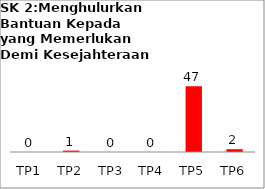
| Category | Bil Pel |
|---|---|
| TP1 | 0 |
| TP2 | 1 |
| TP3 | 0 |
| TP4 | 0 |
| TP5 | 47 |
| TP6 | 2 |